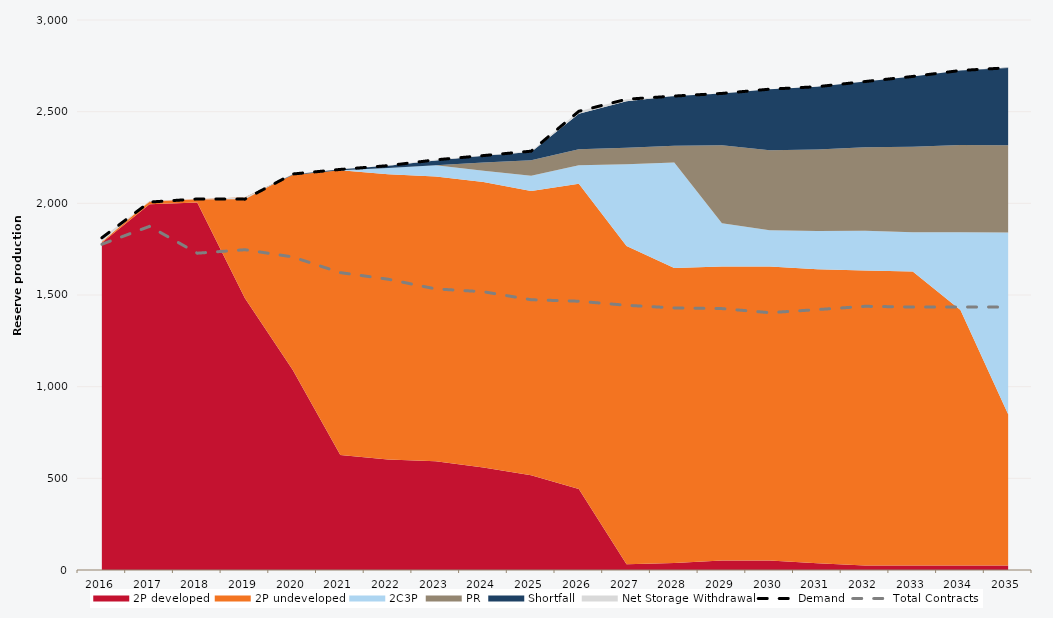
| Category | Demand | Total Contracts |
|---|---|---|
| 0 | 1812.091 | 1776.781 |
| 1 | 2006.953 | 1874.371 |
| 2 | 2023.646 | 1727.997 |
| 3 | 2022.926 | 1746.967 |
| 4 | 2159.896 | 1707.643 |
| 5 | 2185.003 | 1621.977 |
| 6 | 2205.594 | 1586.126 |
| 7 | 2237.285 | 1533.126 |
| 8 | 2260.479 | 1517.777 |
| 9 | 2284.425 | 1474.136 |
| 10 | 2502.135 | 1466.013 |
| 11 | 2567.719 | 1443.817 |
| 12 | 2585.137 | 1429.645 |
| 13 | 2599.451 | 1425.788 |
| 14 | 2622.696 | 1403.548 |
| 15 | 2636.201 | 1420.349 |
| 16 | 2664.317 | 1438.314 |
| 17 | 2691.999 | 1434.467 |
| 18 | 2724.616 | 1434.453 |
| 19 | 2739.361 | 1434.032 |